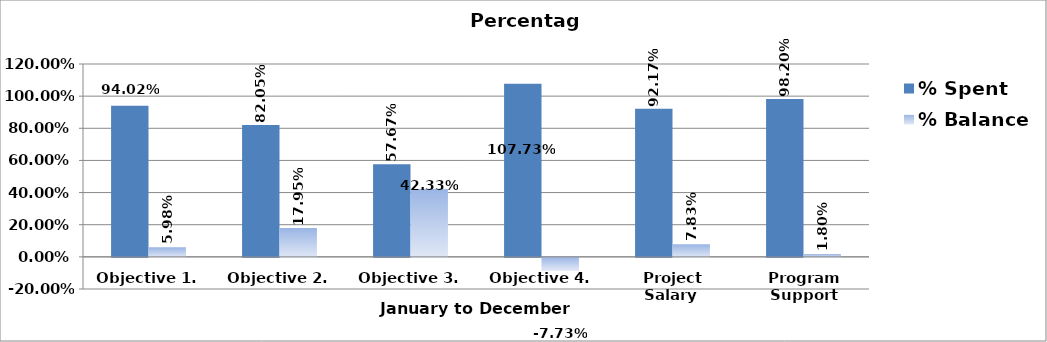
| Category | % Spent  | % Balance  |
|---|---|---|
| Objective 1. | 0.94 | 0.06 |
| Objective 2. | 0.821 | 0.179 |
| Objective 3. | 0.577 | 0.423 |
| Objective 4. | 1.077 | -0.077 |
| Project Salary  | 0.922 | 0.078 |
| Program Support | 0.982 | 0.018 |